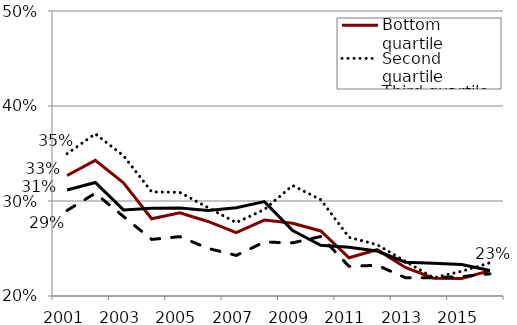
| Category | Bottom quartile | Second quartile | Third quartile | Top quartile |
|---|---|---|---|---|
| 2001.0 | 32.689 | 34.979 | 29.006 | 31.154 |
| 2002.0 | 34.28 | 37.072 | 30.817 | 31.952 |
| 2003.0 | 31.904 | 34.767 | 28.371 | 29.064 |
| 2004.0 | 28.13 | 30.966 | 25.955 | 29.238 |
| 2005.0 | 28.759 | 30.91 | 26.25 | 29.272 |
| 2006.0 | 27.847 | 29.302 | 25.017 | 29.013 |
| 2007.0 | 26.67 | 27.723 | 24.272 | 29.292 |
| 2008.0 | 27.992 | 29.103 | 25.68 | 29.931 |
| 2009.0 | 27.654 | 31.632 | 25.596 | 26.895 |
| 2010.0 | 26.845 | 30.142 | 26.261 | 25.337 |
| 2011.0 | 24.02 | 26.18 | 23.121 | 25.143 |
| 2012.0 | 24.875 | 25.399 | 23.235 | 24.735 |
| 2013.0 | 23.003 | 23.646 | 21.928 | 23.556 |
| 2014.0 | 21.872 | 21.917 | 21.923 | 23.44 |
| 2015.0 | 21.845 | 22.602 | 22.034 | 23.307 |
| 2016.0 | 22.67 | 23.497 | 22.337 | 22.675 |